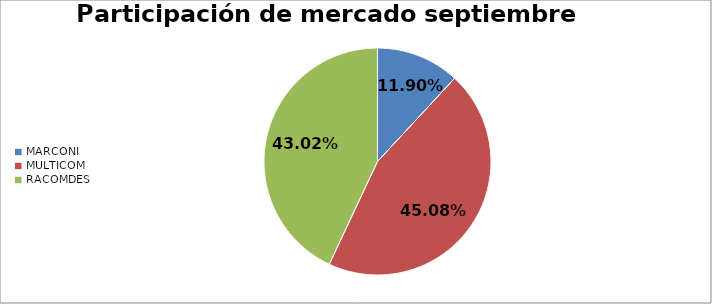
| Category | Series 0 |
|---|---|
| MARCONI | 0.119 |
| MULTICOM | 0.451 |
| RACOMDES | 0.43 |